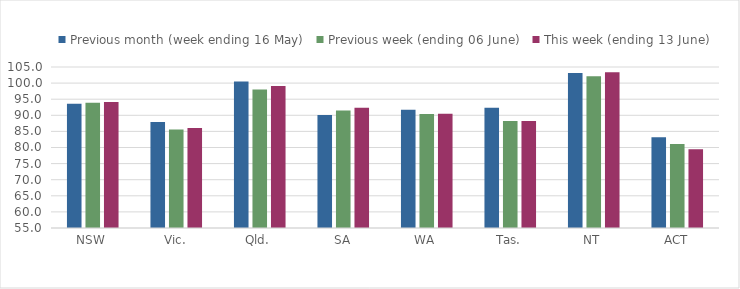
| Category | Previous month (week ending 16 May) | Previous week (ending 06 June) | This week (ending 13 June) |
|---|---|---|---|
| NSW | 93.552 | 93.912 | 94.141 |
| Vic. | 87.94 | 85.569 | 86.076 |
| Qld. | 100.469 | 98.014 | 99.109 |
| SA | 90.106 | 91.494 | 92.346 |
| WA | 91.701 | 90.436 | 90.509 |
| Tas. | 92.369 | 88.243 | 88.22 |
| NT | 103.141 | 102.094 | 103.335 |
| ACT | 83.158 | 81.053 | 79.453 |